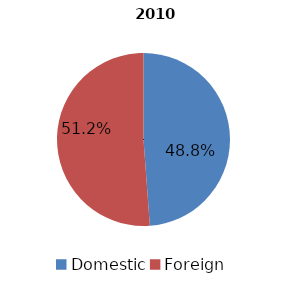
| Category | 2010 |
|---|---|
| Domestic | 540258920 |
| Foreign | 566227462 |